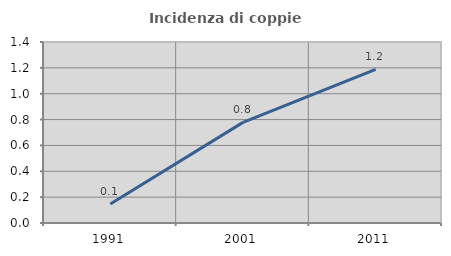
| Category | Incidenza di coppie miste |
|---|---|
| 1991.0 | 0.147 |
| 2001.0 | 0.778 |
| 2011.0 | 1.188 |